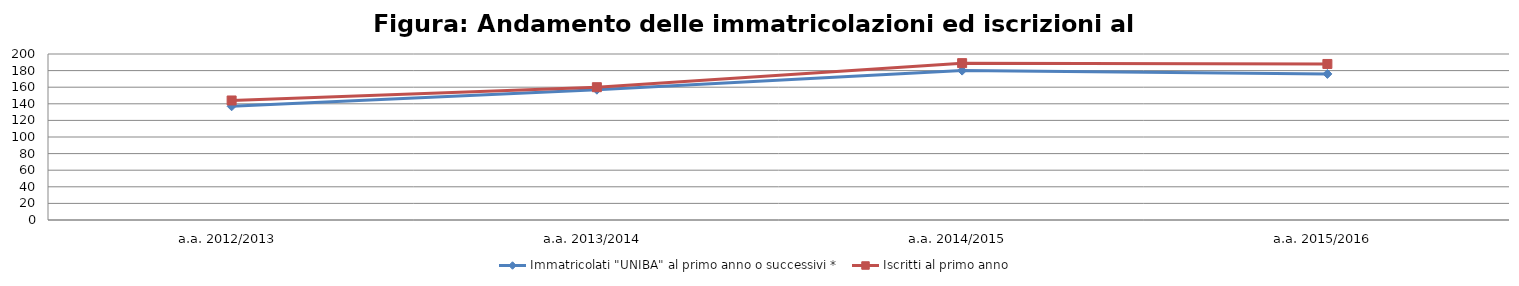
| Category | Immatricolati "UNIBA" al primo anno o successivi * | Iscritti al primo anno  |
|---|---|---|
| a.a. 2012/2013 | 137 | 144 |
| a.a. 2013/2014 | 157 | 160 |
| a.a. 2014/2015 | 180 | 189 |
| a.a. 2015/2016 | 176 | 188 |